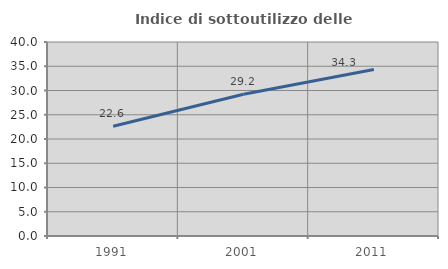
| Category | Indice di sottoutilizzo delle abitazioni  |
|---|---|
| 1991.0 | 22.635 |
| 2001.0 | 29.221 |
| 2011.0 | 34.314 |